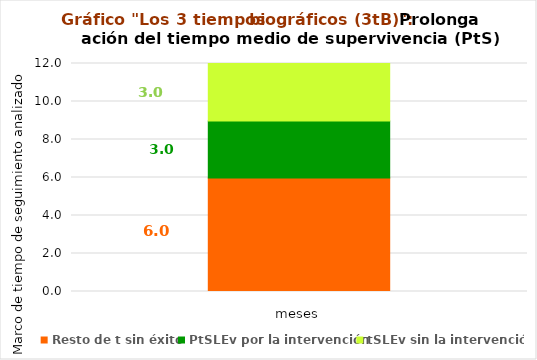
| Category | Resto de t sin éxito | PtSLEv por la intervención | tSLEv sin la intervención |
|---|---|---|---|
| 0 | 5.969 | 3 | 3.032 |